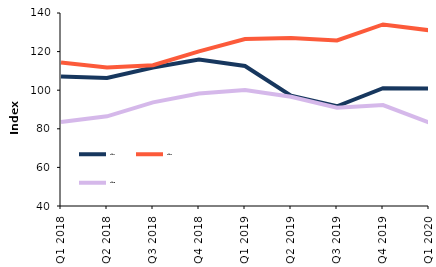
| Category | Series 1 | Series 2 | Series 3 |
|---|---|---|---|
| Q1 2018 | 107.067 | 114.41 | 83.576 |
| Q2 2018 | 106.285 | 111.716 | 86.482 |
| Q3 2018 | 111.753 | 112.91 | 93.715 |
| Q4 2018 | 115.88 | 120.12 | 98.238 |
| Q1 2019 | 112.542 | 126.475 | 100.037 |
| Q2 2019 | 97.169 | 127.047 | 96.602 |
| Q3 2019 | 91.682 | 125.784 | 90.936 |
| Q4 2019 | 101.063 | 134.064 | 92.268 |
| Q1 2020 | 100.935 | 131.062 | 83.233 |